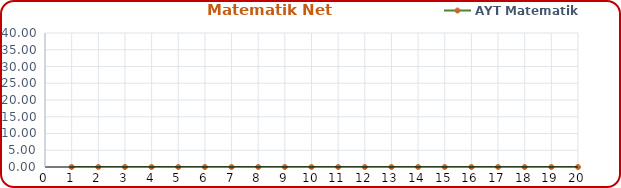
| Category | AYT Matematik |
|---|---|
| 0 | 0 |
| 1 | 0 |
| 2 | 0 |
| 3 | 0 |
| 4 | 0 |
| 5 | 0 |
| 6 | 0 |
| 7 | 0 |
| 8 | 0 |
| 9 | 0 |
| 10 | 0 |
| 11 | 0 |
| 12 | 0 |
| 13 | 0 |
| 14 | 0 |
| 15 | 0 |
| 16 | 0 |
| 17 | 0 |
| 18 | 0 |
| 19 | 0 |